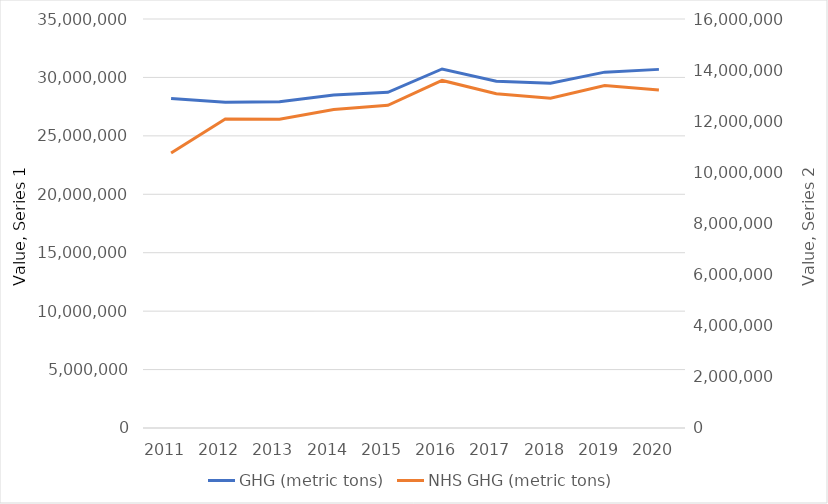
| Category | GHG (metric tons) |
|---|---|
| 2011.0 | 28190132.91 |
| 2012.0 | 27868962.496 |
| 2013.0 | 27916279.38 |
| 2014.0 | 28498071.9 |
| 2015.0 | 28725761.67 |
| 2016.0 | 30722327.77 |
| 2017.0 | 29665896.697 |
| 2018.0 | 29497681.147 |
| 2019.0 | 30451346.01 |
| 2020.0 | 30689035.552 |